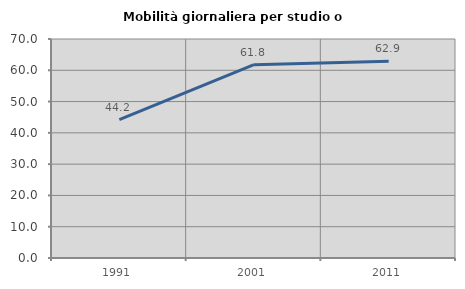
| Category | Mobilità giornaliera per studio o lavoro |
|---|---|
| 1991.0 | 44.226 |
| 2001.0 | 61.802 |
| 2011.0 | 62.903 |